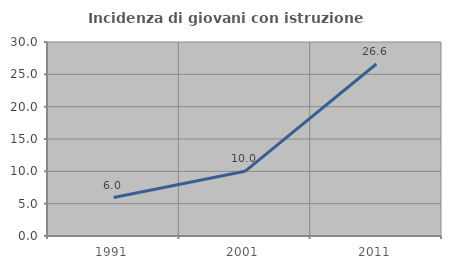
| Category | Incidenza di giovani con istruzione universitaria |
|---|---|
| 1991.0 | 5.952 |
| 2001.0 | 10 |
| 2011.0 | 26.596 |